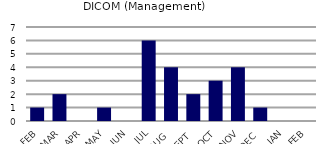
| Category | DICOM (Management) |
|---|---|
| FEB | 1 |
| MAR | 2 |
| APR | 0 |
| MAY | 1 |
| JUN | 0 |
| JUL | 6 |
| AUG | 4 |
| SEPT | 2 |
| OCT | 3 |
| NOV | 4 |
| DEC | 1 |
| JAN | 0 |
| FEB | 0 |